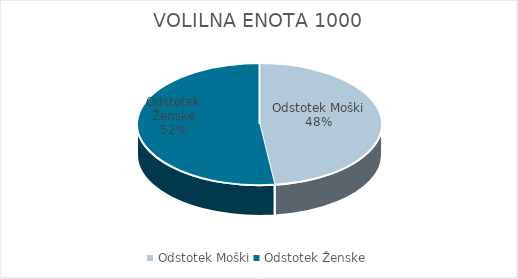
| Category | VOLILNA ENOTA 1000 |
|---|---|
| Odstotek Moški | 21.34 |
| Odstotek Ženske | 23.08 |